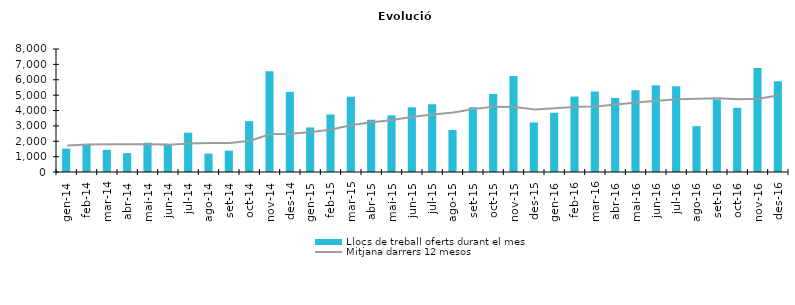
| Category | Llocs de treball oferts durant el mes |
|---|---|
| gen-14 | 1524 |
| feb-14 | 1772 |
| mar-14 | 1441 |
| abr-14 | 1228 |
| mai-14 | 1902 |
| jun-14 | 1817 |
| jul-14 | 2557 |
| ago-14 | 1197 |
| set-14 | 1388 |
| oct-14 | 3309 |
| nov-14 | 6555 |
| des-14 | 5213 |
| gen-15 | 2898 |
| feb-15 | 3740 |
| mar-15 | 4899 |
| abr-15 | 3400 |
| mai-15 | 3687 |
| jun-15 | 4205 |
| jul-15 | 4404 |
| ago-15 | 2731 |
| set-15 | 4212 |
| oct-15 | 5076 |
| nov-15 | 6242 |
| des-15 | 3226 |
| gen-16 | 3852 |
| feb-16 | 4906 |
| mar-16 | 5234 |
| abr-16 | 4818 |
| mai-16 | 5320 |
| jun-16 | 5650 |
| jul-16 | 5582 |
| ago-16 | 2982 |
| set-16 | 4715 |
| oct-16 | 4175 |
| nov-16 | 6759 |
| des-16 | 5907 |